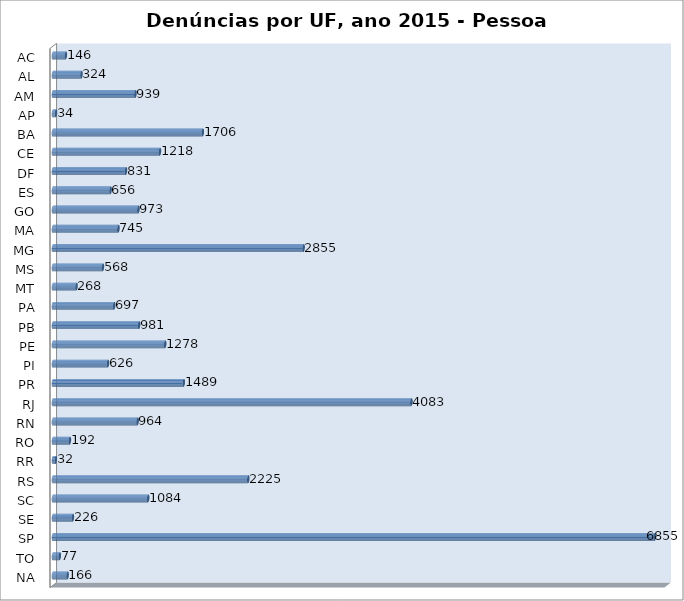
| Category | Series 0 |
|---|---|
| AC | 146 |
| AL | 324 |
| AM | 939 |
| AP | 34 |
| BA | 1706 |
| CE | 1218 |
| DF | 831 |
| ES | 656 |
| GO | 973 |
| MA | 745 |
| MG | 2855 |
| MS | 568 |
| MT | 268 |
| PA | 697 |
| PB | 981 |
| PE | 1278 |
| PI | 626 |
| PR | 1489 |
| RJ | 4083 |
| RN | 964 |
| RO | 192 |
| RR | 32 |
| RS | 2225 |
| SC | 1084 |
| SE | 226 |
| SP | 6855 |
| TO | 77 |
| NA | 166 |